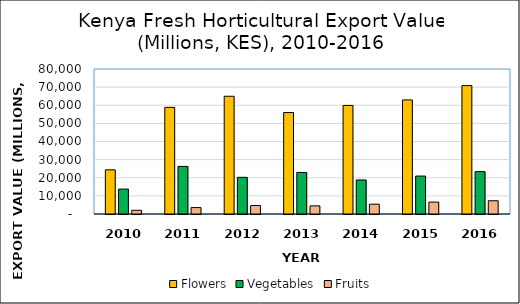
| Category | Flowers | Vegetables | Fruits |
|---|---|---|---|
| 2010.0 | 24379 | 13744 | 2047 |
| 2011.0 | 58835 | 26251 | 3535 |
| 2012.0 | 64964 | 20226 | 4680 |
| 2013.0 | 55976 | 22923 | 4483 |
| 2014.0 | 59893 | 18781 | 5411 |
| 2015.0 | 62937 | 20939 | 6562 |
| 2016.0 | 70829 | 23367 | 7317 |